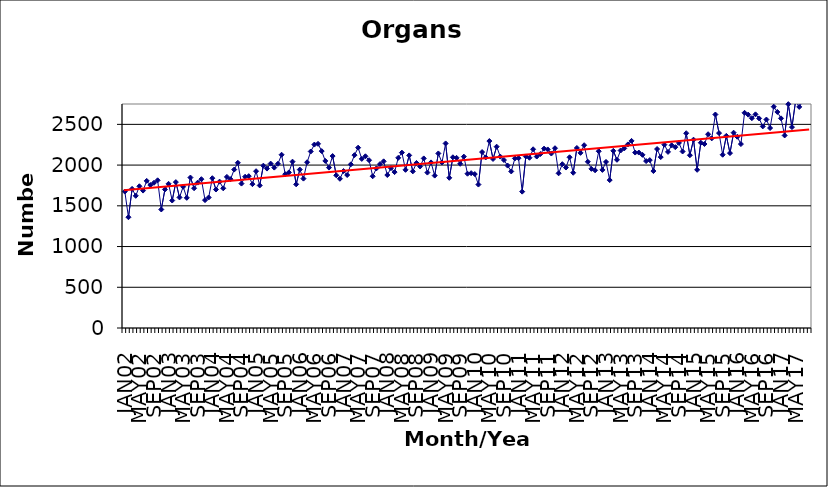
| Category | Series 0 |
|---|---|
| JAN02 | 1675 |
| FEB02 | 1360 |
| MAR02 | 1708 |
| APR02 | 1623 |
| MAY02 | 1740 |
| JUN02 | 1687 |
| JUL02 | 1806 |
| AUG02 | 1755 |
| SEP02 | 1783 |
| OCT02 | 1813 |
| NOV02 | 1455 |
| DEC02 | 1701 |
| JAN03 | 1770 |
| FEB03 | 1565 |
| MAR03 | 1791 |
| APR03 | 1603 |
| MAY03 | 1734 |
| JUN03 | 1598 |
| JUL03 | 1847 |
| AUG03 | 1716 |
| SEP03 | 1785 |
| OCT03 | 1827 |
| NOV03 | 1570 |
| DEC03 | 1602 |
| JAN04 | 1839 |
| FEB04 | 1700 |
| MAR04 | 1797 |
| APR04 | 1715 |
| MAY04 | 1855 |
| JUN04 | 1827 |
| JUL04 | 1945 |
| AUG04 | 2028 |
| SEP04 | 1773 |
| OCT04 | 1857 |
| NOV04 | 1864 |
| DEC04 | 1766 |
| JAN05 | 1925 |
| FEB05 | 1750 |
| MAR05 | 1993 |
| APR05 | 1957 |
| MAY05 | 2018 |
| JUN05 | 1969 |
| JUL05 | 2016 |
| AUG05 | 2127 |
| SEP05 | 1888 |
| OCT05 | 1910 |
| NOV05 | 2042 |
| DEC05 | 1764 |
| JAN06 | 1945 |
| FEB06 | 1834 |
| MAR06 | 2035 |
| APR06 | 2167 |
| MAY06 | 2252 |
| JUN06 | 2261 |
| JUL06 | 2172 |
| AUG06 | 2051 |
| SEP06 | 1969 |
| OCT06 | 2111 |
| NOV06 | 1875 |
| DEC06 | 1832 |
| JAN07 | 1927 |
| FEB07 | 1878 |
| MAR07 | 2009 |
| APR07 | 2122 |
| MAY07 | 2214 |
| JUN07 | 2076 |
| JUL07 | 2108 |
| AUG07 | 2060 |
| SEP07 | 1863 |
| OCT07 | 1959 |
| NOV07 | 2012 |
| DEC07 | 2046 |
| JAN08 | 1878 |
| FEB08 | 1962 |
| MAR08 | 1914 |
| APR08 | 2089 |
| MAY08 | 2153 |
| JUN08 | 1942 |
| JUL08 | 2119 |
| AUG08 | 1923 |
| SEP08 | 2026 |
| OCT08 | 1983 |
| NOV08 | 2082 |
| DEC08 | 1908 |
| JAN09 | 2033 |
| FEB09 | 1871 |
| MAR09 | 2143 |
| APR09 | 2032 |
| MAY09 | 2266 |
| JUN09 | 1844 |
| JUL09 | 2096 |
| AUG09 | 2089 |
| SEP09 | 2016 |
| OCT09 | 2104 |
| NOV09 | 1894 |
| DEC09 | 1901 |
| JAN10 | 1890 |
| FEB10 | 1761 |
| MAR10 | 2160 |
| APR10 | 2094 |
| MAY10 | 2295 |
| JUN10 | 2075 |
| JUL10 | 2226 |
| AUG10 | 2104 |
| SEP10 | 2062 |
| OCT10 | 1994 |
| NOV10 | 1922 |
| DEC10 | 2082 |
| JAN11 | 2085 |
| FEB11 | 1674 |
| MAR11 | 2106 |
| APR11 | 2090 |
| MAY11 | 2194 |
| JUN11 | 2105 |
| JUL11 | 2136 |
| AUG11 | 2202 |
| SEP11 | 2192 |
| OCT11 | 2142 |
| NOV11 | 2207 |
| DEC11 | 1899 |
| JAN12 | 2011 |
| FEB12 | 1970 |
| MAR12 | 2096 |
| APR12 | 1906 |
| MAY12 | 2210 |
| JUN12 | 2150 |
| JUL12 | 2244 |
| AUG12 | 2041 |
| SEP12 | 1954 |
| OCT12 | 1936 |
| NOV12 | 2170 |
| DEC12 | 1941 |
| JAN13 | 2039 |
| FEB13 | 1816 |
| MAR13 | 2175 |
| APR13 | 2065 |
| MAY13 | 2179 |
| JUN13 | 2205 |
| JUL13 | 2254 |
| AUG13 | 2297 |
| SEP13 | 2154 |
| OCT13 | 2154 |
| NOV13 | 2126 |
| DEC13 | 2049 |
| JAN14 | 2061 |
| FEB14 | 1927 |
| MAR14 | 2197 |
| APR14 | 2098 |
| MAY14 | 2251 |
| JUN14 | 2162 |
| JUL14 | 2243 |
| AUG14 | 2220 |
| SEP14 | 2272 |
| OCT14 | 2167 |
| NOV14 | 2391 |
| DEC14 | 2121 |
| JAN15 | 2312 |
| FEB15 | 1942 |
| MAR15 | 2275 |
| APR15 | 2259 |
| MAY15 | 2379 |
| JUN15 | 2328 |
| JUL15 | 2621 |
| AUG15 | 2393 |
| SEP15 | 2127 |
| OCT15 | 2359 |
| NOV15 | 2147 |
| DEC15 | 2398 |
| JAN16 | 2348 |
| FEB16 | 2258 |
| MAR16 | 2642 |
| APR16 | 2619 |
| MAY16 | 2576 |
| JUN16 | 2623 |
| JUL16 | 2573 |
| AUG16 | 2475 |
| SEP16 | 2559 |
| OCT16 | 2455 |
| NOV16 | 2717 |
| DEC16 | 2652 |
| JAN17 | 2574 |
| FEB17 | 2364 |
| MAR17 | 2748 |
| APR17 | 2466 |
| MAY17 | 2787 |
| JUN17 | 2714 |
| JUL17 | 2786 |